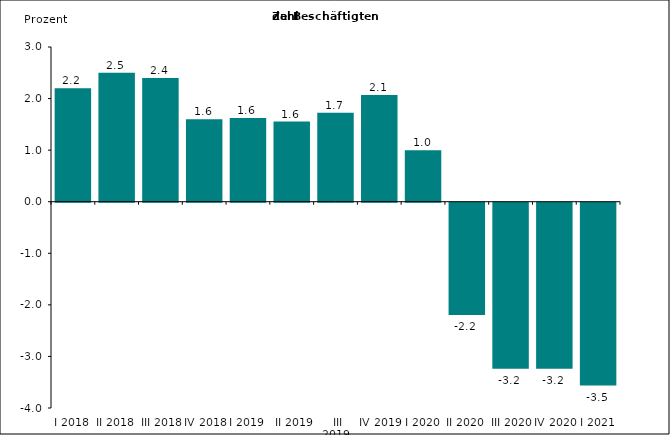
| Category | Series 0 |
|---|---|
| I 2018 | 2.2 |
| II 2018 | 2.5 |
| III 2018 | 2.4 |
| IV 2018 | 1.6 |
| I 2019 | 1.626 |
|  II 2019 | 1.554 |
|  III 2019 | 1.726 |
| IV 2019 | 2.07 |
| I 2020 | 1 |
| II 2020 | -2.176 |
| III 2020 | -3.218 |
| IV 2020 | -3.22 |
| I 2021 | -3.546 |